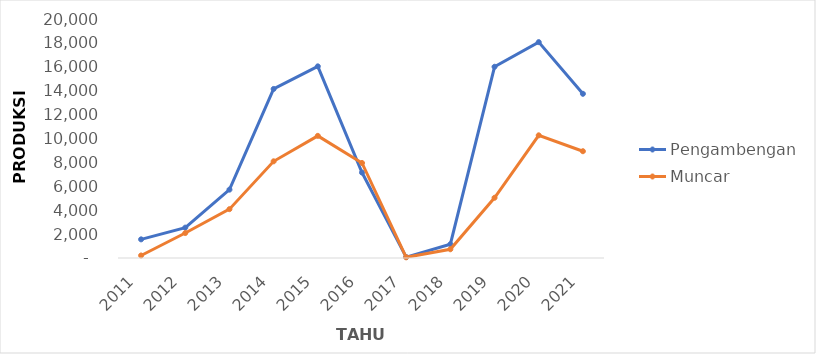
| Category | Pengambengan |  Muncar   |
|---|---|---|
| 2011.0 | 1560 | 211 |
| 2012.0 | 2542 | 2089 |
| 2013.0 | 5720 | 4088 |
| 2014.0 | 14146 | 8091 |
| 2015.0 | 16038 | 10222 |
| 2016.0 | 7150 | 7951 |
| 2017.0 | 77 | 58 |
| 2018.0 | 1154 | 731 |
| 2019.0 | 16003 | 5042 |
| 2020.0 | 18065 | 10266 |
| 2021.0 | 13740 | 8935 |